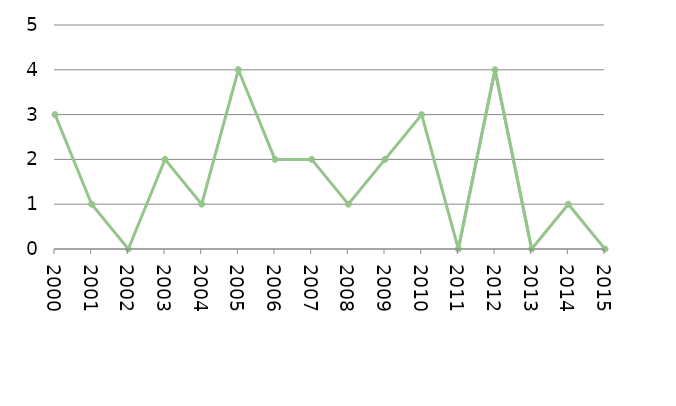
| Category | Avlidna |
|---|---|
| 2000.0 | 3 |
| 2001.0 | 1 |
| 2002.0 | 0 |
| 2003.0 | 2 |
| 2004.0 | 1 |
| 2005.0 | 4 |
| 2006.0 | 2 |
| 2007.0 | 2 |
| 2008.0 | 1 |
| 2009.0 | 2 |
| 2010.0 | 3 |
| 2011.0 | 0 |
| 2012.0 | 4 |
| 2013.0 | 0 |
| 2014.0 | 1 |
| 2015.0 | 0 |